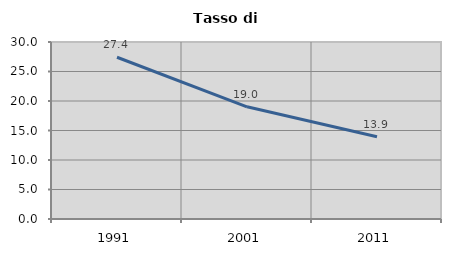
| Category | Tasso di disoccupazione   |
|---|---|
| 1991.0 | 27.413 |
| 2001.0 | 19.016 |
| 2011.0 | 13.943 |